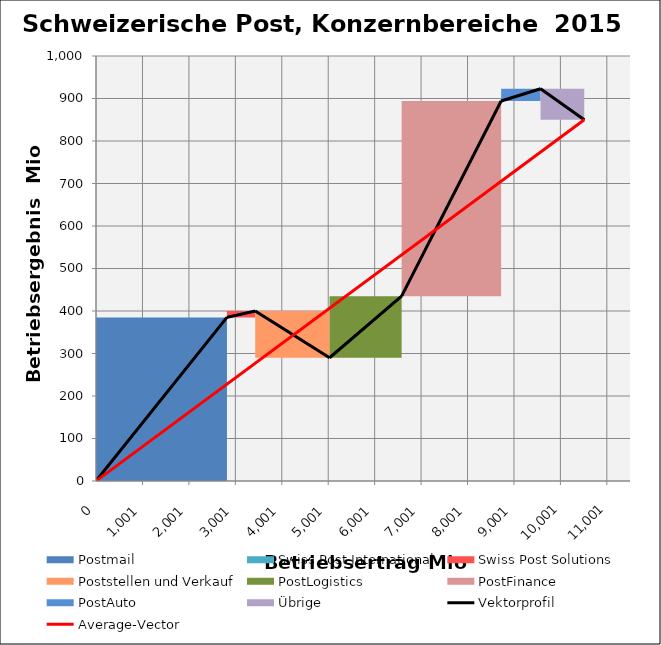
| Category | transparent | Postmail | Swiss Post International | Swiss Post Solutions | Poststellen und Verkauf | PostLogistics | PostFinance | PostAuto | Übrige | Border right & top |
|---|---|---|---|---|---|---|---|---|---|---|
| 0.0 | 0 | 385 | 0 | 0 | 0 | 0 | 0 | 0 | 0 | 0 |
| 2820.0 | 0 | 385 | 0 | 0 | 0 | 0 | 0 | 0 | 0 | 0 |
| 2820.0 | 385 | 0 | 0 | 0 | 0 | 0 | 0 | 0 | 0 | 0 |
| 2820.0 | 385 | 0 | 0 | 0 | 0 | 0 | 0 | 0 | 0 | 0 |
| 2820.0 | 385 | 0 | 0 | 15 | 0 | 0 | 0 | 0 | 0 | 0 |
| 3429.0 | 385 | 0 | 0 | 15 | 0 | 0 | 0 | 0 | 0 | 0 |
| 3429.0 | 400 | 0 | 0 | 0 | -110 | 0 | 0 | 0 | 0 | 0 |
| 5030.0 | 400 | 0 | 0 | 0 | -110 | 0 | 0 | 0 | 0 | 0 |
| 5030.0 | 290 | 0 | 0 | 0 | 0 | 145 | 0 | 0 | 0 | 0 |
| 6582.0 | 290 | 0 | 0 | 0 | 0 | 145 | 0 | 0 | 0 | 0 |
| 6582.0 | 435 | 0 | 0 | 0 | 0 | 0 | 459 | 0 | 0 | 0 |
| 8725.0 | 435 | 0 | 0 | 0 | 0 | 0 | 459 | 0 | 0 | 0 |
| 8725.0 | 894 | 0 | 0 | 0 | 0 | 0 | 0 | 29 | 0 | 0 |
| 9574.0 | 894 | 0 | 0 | 0 | 0 | 0 | 0 | 29 | 0 | 0 |
| 9574.0 | 923 | 0 | 0 | 0 | 0 | 0 | 0 | 0 | -73 | 0 |
| 10515.0 | 923 | 0 | 0 | 0 | 0 | 0 | 0 | 0 | -73 | 0 |
| 10515.0 | 850 | 0 | 0 | 0 | 0 | 0 | 0 | 0 | 0 | 0 |
| 10515.0 | 850 | 0 | 0 | 0 | 0 | 0 | 0 | 0 | 0 | 0 |
| 10515.0 | 850 | 0 | 0 | 0 | 0 | 0 | 0 | 0 | 0 | 0 |
| 10515.0 | 850 | 0 | 0 | 0 | 0 | 0 | 0 | 0 | 0 | 0 |
| 10515.0 | 850 | 0 | 0 | 0 | 0 | 0 | 0 | 0 | 0 | 0 |
| 11500.0 | 850 | 0 | 0 | 0 | 0 | 0 | 0 | 0 | 0 | 0 |
| 11500.0 | 850 | 0 | 0 | 0 | 0 | 0 | 0 | 0 | 0 | 0 |